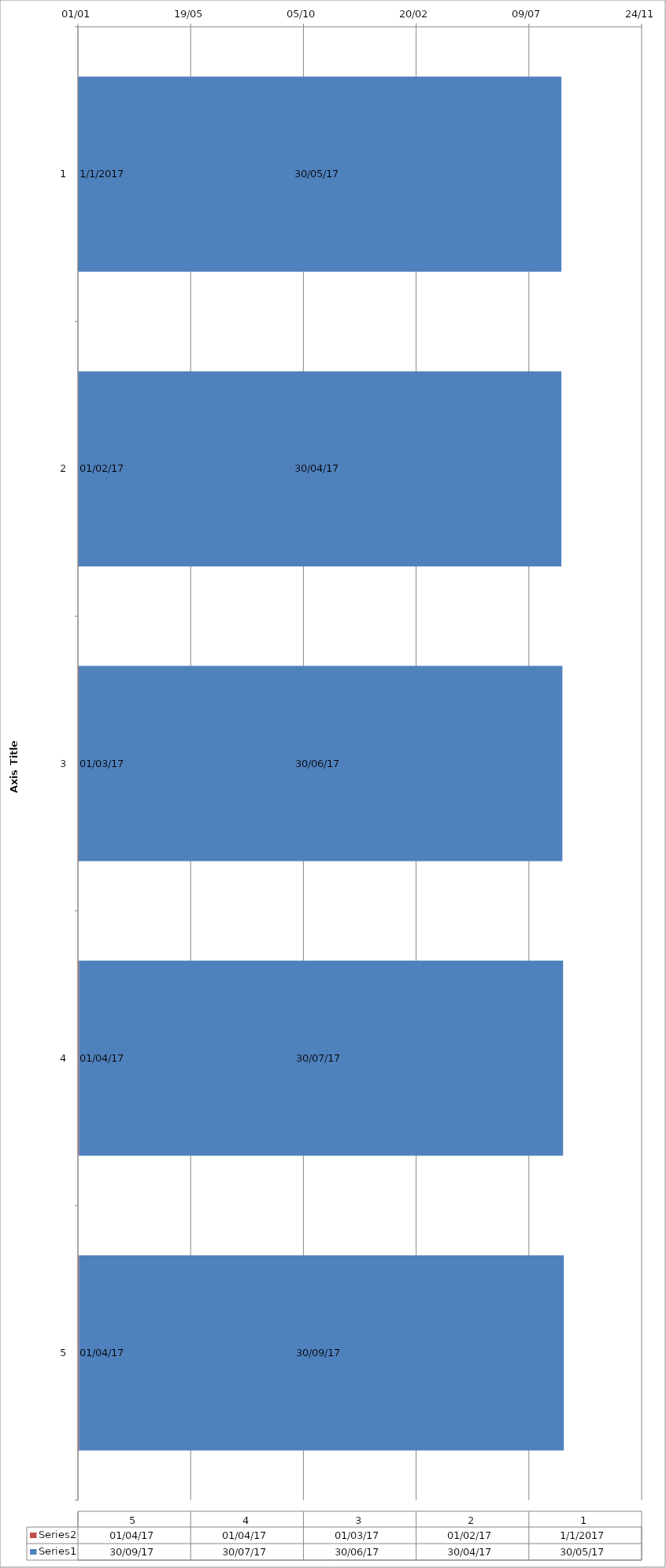
| Category | Series 1 | Series 0 |
|---|---|---|
| 0 | 2017-01-01 | 2017-05-30 |
| 1 | 2017-02-01 | 2017-04-30 |
| 2 | 2017-03-01 | 2017-06-30 |
| 3 | 2017-04-01 | 2017-07-30 |
| 4 | 2017-04-01 | 2017-09-30 |